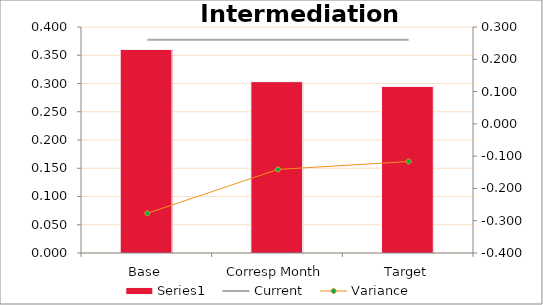
| Category | Series 0 |
|---|---|
| Base | 0.36 |
| Corresp Month | 0.303 |
| Target | 0.295 |